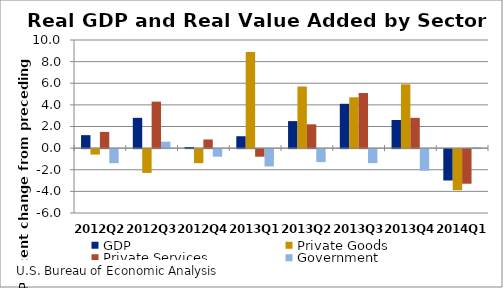
| Category | GDP | Private Goods | Private Services | Government |
|---|---|---|---|---|
| 2012Q2 | 1.2 | -0.5 | 1.5 | -1.3 |
| 2012Q3 | 2.8 | -2.2 | 4.3 | 0.6 |
| 2012Q4 | 0.1 | -1.3 | 0.8 | -0.7 |
| 2013Q1 | 1.1 | 8.9 | -0.7 | -1.6 |
| 2013Q2 | 2.5 | 5.7 | 2.2 | -1.2 |
| 2013Q3 | 4.1 | 4.7 | 5.1 | -1.3 |
| 2013Q4 | 2.6 | 5.9 | 2.8 | -2 |
| 2014Q1 | -2.9 | -3.8 | -3.2 | 0.1 |